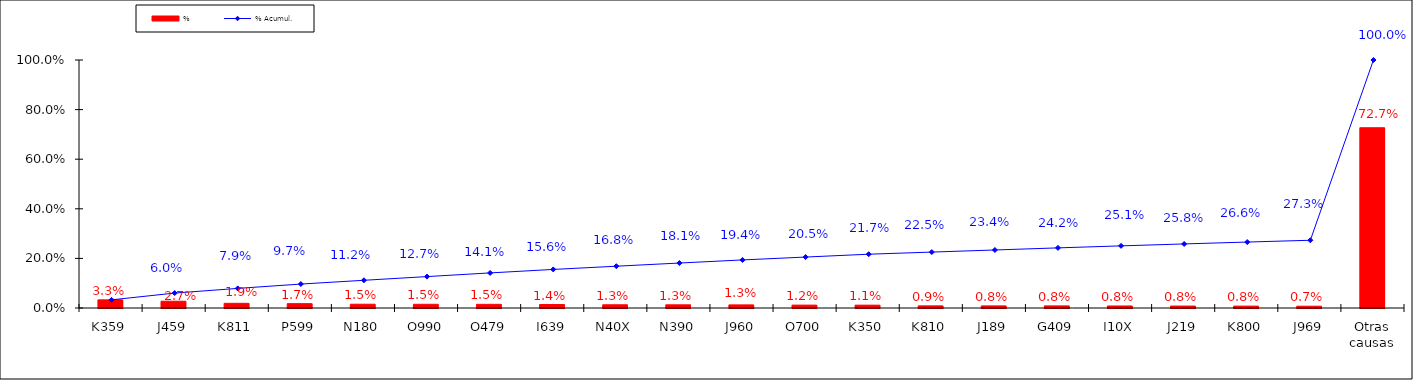
| Category | % |
|---|---|
| K359 | 0.033 |
| J459 | 0.027 |
| K811 | 0.019 |
| P599 | 0.017 |
| N180 | 0.015 |
| O990 | 0.015 |
| O479 | 0.015 |
| I639 | 0.014 |
| N40X | 0.013 |
| N390 | 0.013 |
| J960 | 0.013 |
| O700 | 0.012 |
| K350 | 0.011 |
| K810 | 0.009 |
| J189 | 0.008 |
| G409 | 0.008 |
| I10X | 0.008 |
| J219 | 0.008 |
| K800 | 0.008 |
| J969 | 0.007 |
| Otras causas | 0.727 |